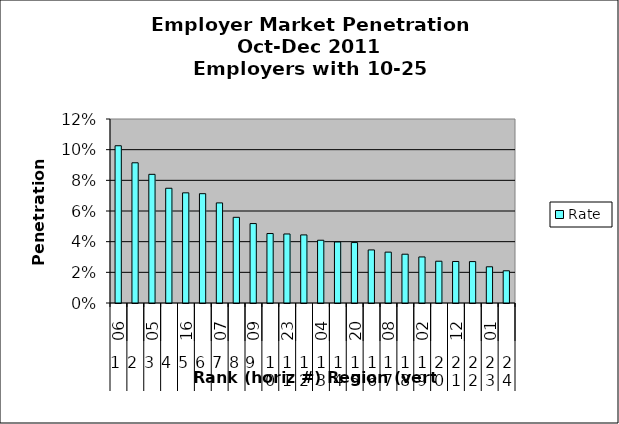
| Category | Rate |
|---|---|
| 0 | 0.103 |
| 1 | 0.091 |
| 2 | 0.084 |
| 3 | 0.075 |
| 4 | 0.072 |
| 5 | 0.071 |
| 6 | 0.065 |
| 7 | 0.056 |
| 8 | 0.052 |
| 9 | 0.045 |
| 10 | 0.045 |
| 11 | 0.044 |
| 12 | 0.041 |
| 13 | 0.04 |
| 14 | 0.039 |
| 15 | 0.035 |
| 16 | 0.033 |
| 17 | 0.032 |
| 18 | 0.03 |
| 19 | 0.027 |
| 20 | 0.027 |
| 21 | 0.027 |
| 22 | 0.024 |
| 23 | 0.021 |